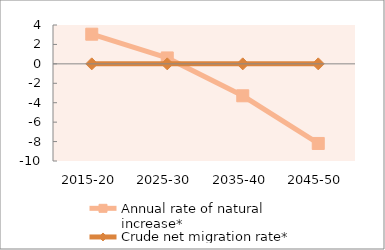
| Category | Annual rate of natural increase* | Crude net migration rate* |
|---|---|---|
| 2015-20 | 3.053 | 0 |
| 2025-30 | 0.609 | 0 |
| 2035-40 | -3.287 | 0 |
| 2045-50 | -8.194 | 0 |